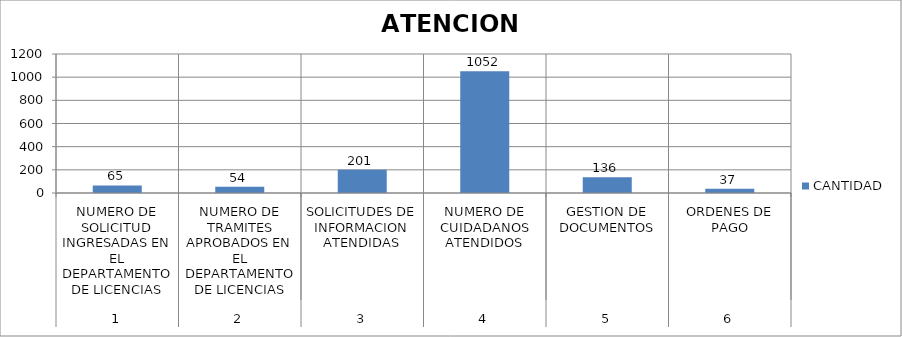
| Category | CANTIDAD |
|---|---|
| 0 | 65 |
| 1 | 54 |
| 2 | 201 |
| 3 | 1052 |
| 4 | 136 |
| 5 | 37 |